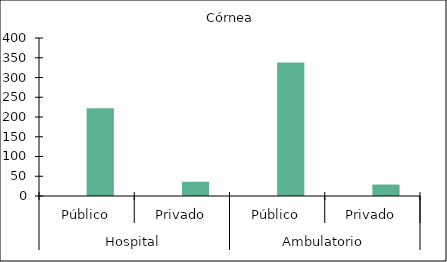
| Category |   |    Córnea |
|---|---|---|
| 0 | 0 | 222 |
| 1 | 0 | 36 |
| 2 | 0 | 338 |
| 3 | 0 | 29 |